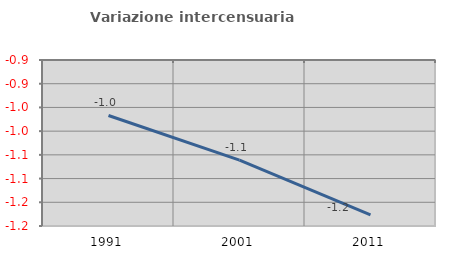
| Category | Variazione intercensuaria annua |
|---|---|
| 1991.0 | -0.967 |
| 2001.0 | -1.061 |
| 2011.0 | -1.177 |